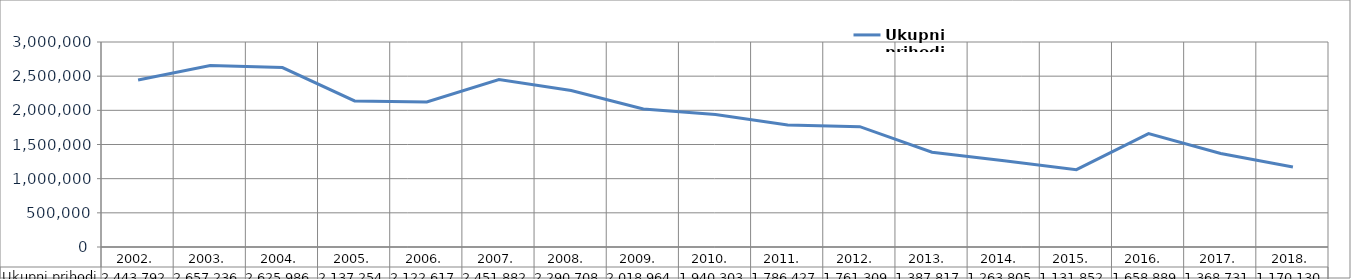
| Category | Ukupni prihodi |
|---|---|
| 2002. | 2443791.657 |
| 2003. | 2657235.727 |
| 2004. | 2625986.39 |
| 2005. | 2137254.281 |
| 2006. | 2122617.455 |
| 2007. | 2451882.268 |
| 2008.  | 2290708.434 |
| 2009.  | 2018963.819 |
| 2010.  | 1940303.308 |
| 2011.  | 1786427.019 |
| 2012.  | 1761308.677 |
| 2013.  | 1387817.317 |
| 2014.  | 1263804.577 |
| 2015.  | 1131852.107 |
| 2016.  | 1658888.864 |
| 2017. | 1368731.237 |
| 2018. | 1170130.2 |